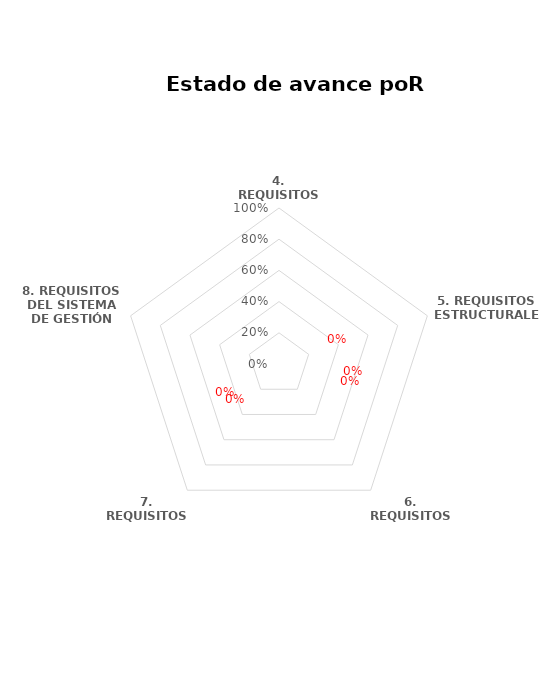
| Category | Series 0 |
|---|---|
| 4. REQUISITOS GENERALES | 0 |
| 5. REQUISITOS ESTRUCTURALES | 0 |
| 6. REQUISITOS DE RECURSOS | 0 |
| 7. REQUISITOS DE PROCESO | 0 |
| 8. REQUISITOS DEL SISTEMA DE GESTIÓN | 0 |